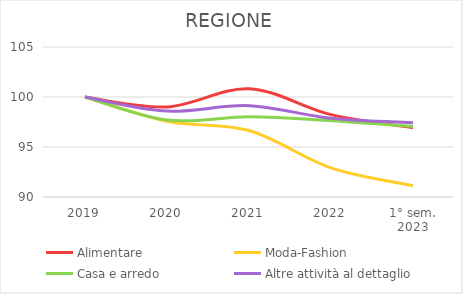
| Category | Alimentare | Moda-Fashion | Casa e arredo | Altre attività al dettaglio |
|---|---|---|---|---|
| 2019 | 100 | 100 | 100 | 100 |
| 2020 | 99.008 | 97.578 | 97.702 | 98.588 |
| 2021 | 100.829 | 96.644 | 98.014 | 99.136 |
| 2022 | 98.235 | 92.916 | 97.636 | 97.87 |
| 1° sem.
2023 | 96.924 | 91.134 | 97.045 | 97.431 |